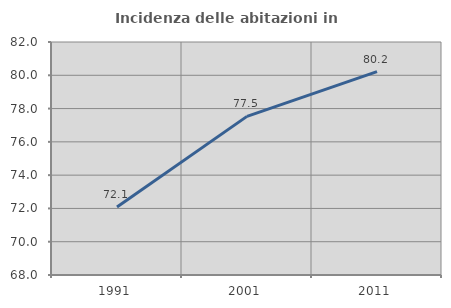
| Category | Incidenza delle abitazioni in proprietà  |
|---|---|
| 1991.0 | 72.086 |
| 2001.0 | 77.532 |
| 2011.0 | 80.221 |